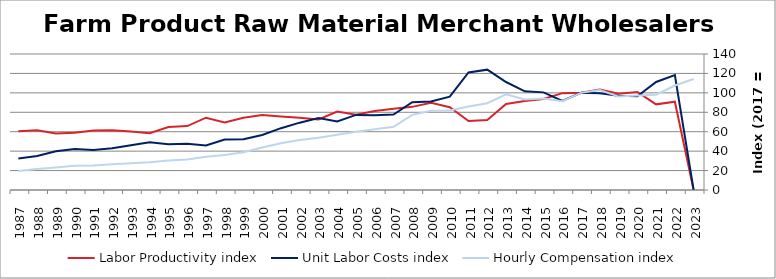
| Category | Labor Productivity index | Unit Labor Costs index | Hourly Compensation index |
|---|---|---|---|
| 2023.0 | 0 | 0 | 114.249 |
| 2022.0 | 90.881 | 118.391 | 107.595 |
| 2021.0 | 88.171 | 111.196 | 98.043 |
| 2020.0 | 100.891 | 96.45 | 97.309 |
| 2019.0 | 99.138 | 96.995 | 96.159 |
| 2018.0 | 103.331 | 99.5 | 102.814 |
| 2017.0 | 100 | 100 | 100 |
| 2016.0 | 99.679 | 91.661 | 91.368 |
| 2015.0 | 93.596 | 100.502 | 94.066 |
| 2014.0 | 91.677 | 101.605 | 93.148 |
| 2013.0 | 88.547 | 111.163 | 98.431 |
| 2012.0 | 72.135 | 123.884 | 89.364 |
| 2011.0 | 70.948 | 121.003 | 85.85 |
| 2010.0 | 85.258 | 96.093 | 81.927 |
| 2009.0 | 89.691 | 91.057 | 81.67 |
| 2008.0 | 85.583 | 90.399 | 77.366 |
| 2007.0 | 83.738 | 77.696 | 65.061 |
| 2006.0 | 81.293 | 76.852 | 62.475 |
| 2005.0 | 77.548 | 77.282 | 59.93 |
| 2004.0 | 80.726 | 70.465 | 56.883 |
| 2003.0 | 72.63 | 74.115 | 53.829 |
| 2002.0 | 74.366 | 69.318 | 51.55 |
| 2001.0 | 75.775 | 63.64 | 48.223 |
| 2000.0 | 77.242 | 56.582 | 43.705 |
| 1999.0 | 74.389 | 52.329 | 38.926 |
| 1998.0 | 69.437 | 51.899 | 36.037 |
| 1997.0 | 74.429 | 45.842 | 34.119 |
| 1996.0 | 65.837 | 47.58 | 31.325 |
| 1995.0 | 64.762 | 47.058 | 30.476 |
| 1994.0 | 58.381 | 49.032 | 28.625 |
| 1993.0 | 60.13 | 45.98 | 27.647 |
| 1992.0 | 61.533 | 42.92 | 26.41 |
| 1991.0 | 61.219 | 41.267 | 25.263 |
| 1990.0 | 58.97 | 42.214 | 24.893 |
| 1989.0 | 58.206 | 39.879 | 23.212 |
| 1988.0 | 61.426 | 35.035 | 21.521 |
| 1987.0 | 60.582 | 32.389 | 19.622 |